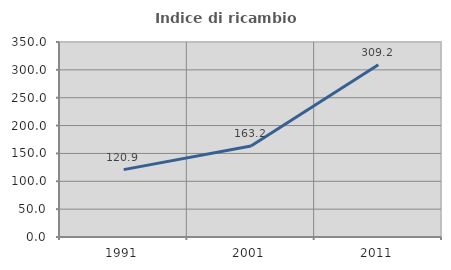
| Category | Indice di ricambio occupazionale  |
|---|---|
| 1991.0 | 120.93 |
| 2001.0 | 163.223 |
| 2011.0 | 309.207 |